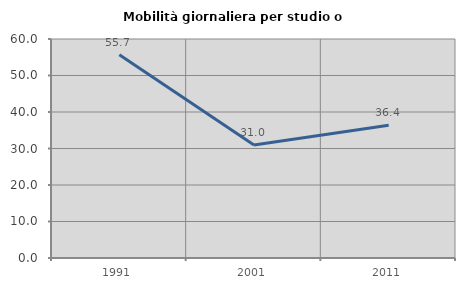
| Category | Mobilità giornaliera per studio o lavoro |
|---|---|
| 1991.0 | 55.714 |
| 2001.0 | 30.986 |
| 2011.0 | 36.364 |